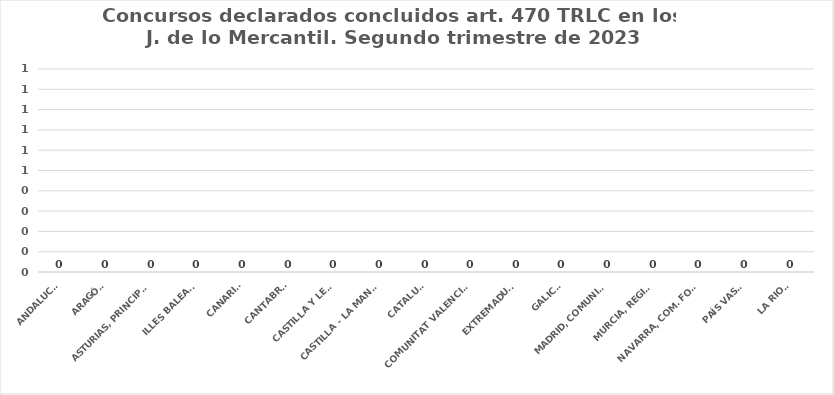
| Category | Series 0 |
|---|---|
| ANDALUCÍA | 0 |
| ARAGÓN | 0 |
| ASTURIAS, PRINCIPADO | 0 |
| ILLES BALEARS | 0 |
| CANARIAS | 0 |
| CANTABRIA | 0 |
| CASTILLA Y LEÓN | 0 |
| CASTILLA - LA MANCHA | 0 |
| CATALUÑA | 0 |
| COMUNITAT VALENCIANA | 0 |
| EXTREMADURA | 0 |
| GALICIA | 0 |
| MADRID, COMUNIDAD | 0 |
| MURCIA, REGIÓN | 0 |
| NAVARRA, COM. FORAL | 0 |
| PAÍS VASCO | 0 |
| LA RIOJA | 0 |